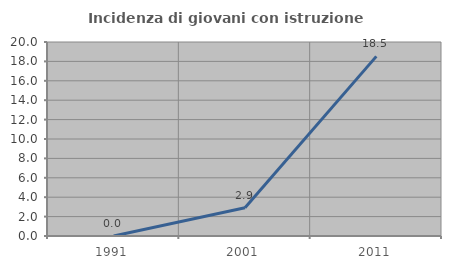
| Category | Incidenza di giovani con istruzione universitaria |
|---|---|
| 1991.0 | 0 |
| 2001.0 | 2.913 |
| 2011.0 | 18.519 |